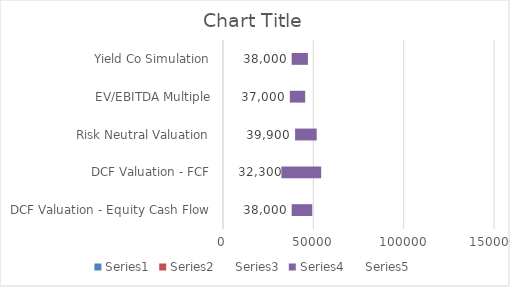
| Category | Series 0 | Series 1 | Series 2 | Series 3 | Series 4 |
|---|---|---|---|---|---|
| DCF Valuation - Equity Cash Flow |  |  | 38000 | 11400 | 49400 |
| DCF Valuation - FCF |  |  | 32300 | 22040 | 54340 |
| Risk Neutral Valuation |  |  | 39900 | 11970 | 51870 |
| EV/EBITDA Multiple |  |  | 37000 | 8500 | 45500 |
| Yield Co Simulation |  |  | 38000 | 9000 | 47000 |